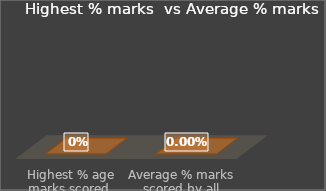
| Category | Series 0 |
|---|---|
| Highest % age marks scored 
(For all Subjects) | 0 |
| Average % marks scored by all Students for all subjects appeared | 0 |